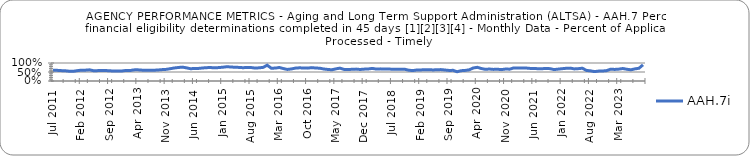
| Category | AAH.7i |
|---|---|
| 2011-07-01 | 0.602 |
| 2011-08-01 | 0.592 |
| 2011-09-01 | 0.577 |
| 2011-10-01 | 0.568 |
| 2011-11-01 | 0.544 |
| 2011-12-01 | 0.539 |
| 2012-01-01 | 0.575 |
| 2012-02-01 | 0.601 |
| 2012-03-01 | 0.601 |
| 2012-04-01 | 0.621 |
| 2012-05-01 | 0.573 |
| 2012-06-01 | 0.576 |
| 2012-07-01 | 0.584 |
| 2012-08-01 | 0.581 |
| 2012-09-01 | 0.569 |
| 2012-10-01 | 0.551 |
| 2012-11-01 | 0.559 |
| 2012-12-01 | 0.556 |
| 2013-01-01 | 0.586 |
| 2013-02-01 | 0.578 |
| 2013-03-01 | 0.618 |
| 2013-04-01 | 0.62 |
| 2013-05-01 | 0.603 |
| 2013-06-01 | 0.593 |
| 2013-07-01 | 0.604 |
| 2013-08-01 | 0.599 |
| 2013-09-01 | 0.613 |
| 2013-10-01 | 0.632 |
| 2013-11-01 | 0.647 |
| 2013-12-01 | 0.684 |
| 2014-01-01 | 0.722 |
| 2014-02-01 | 0.75 |
| 2014-03-01 | 0.771 |
| 2014-04-01 | 0.732 |
| 2014-05-01 | 0.683 |
| 2014-06-01 | 0.692 |
| 2014-07-01 | 0.699 |
| 2014-08-01 | 0.722 |
| 2014-09-01 | 0.742 |
| 2014-10-01 | 0.746 |
| 2014-11-01 | 0.734 |
| 2014-12-01 | 0.745 |
| 2015-01-01 | 0.765 |
| 2015-02-01 | 0.792 |
| 2015-03-01 | 0.78 |
| 2015-04-01 | 0.761 |
| 2015-05-01 | 0.756 |
| 2015-06-01 | 0.739 |
| 2015-07-01 | 0.751 |
| 2015-08-01 | 0.748 |
| 2015-09-01 | 0.718 |
| 2015-10-01 | 0.732 |
| 2015-11-01 | 0.757 |
| 2015-12-01 | 0.878 |
| 2016-01-01 | 0.713 |
| 2016-02-01 | 0.716 |
| 2016-03-01 | 0.751 |
| 2016-04-01 | 0.691 |
| 2016-05-01 | 0.642 |
| 2016-06-01 | 0.671 |
| 2016-07-01 | 0.716 |
| 2016-08-01 | 0.733 |
| 2016-09-01 | 0.723 |
| 2016-10-01 | 0.715 |
| 2016-11-01 | 0.743 |
| 2016-12-01 | 0.722 |
| 2017-01-01 | 0.711 |
| 2017-02-01 | 0.666 |
| 2017-03-01 | 0.642 |
| 2017-04-01 | 0.623 |
| 2017-05-01 | 0.674 |
| 2017-06-01 | 0.714 |
| 2017-07-01 | 0.645 |
| 2017-08-01 | 0.642 |
| 2017-09-01 | 0.648 |
| 2017-10-01 | 0.661 |
| 2017-11-01 | 0.64 |
| 2017-12-01 | 0.659 |
| 2018-01-01 | 0.668 |
| 2018-02-01 | 0.7 |
| 2018-03-01 | 0.661 |
| 2018-04-01 | 0.674 |
| 2018-05-01 | 0.663 |
| 2018-06-01 | 0.671 |
| 2018-07-01 | 0.649 |
| 2018-08-01 | 0.646 |
| 2018-09-01 | 0.647 |
| 2018-10-01 | 0.654 |
| 2018-11-01 | 0.601 |
| 2018-12-01 | 0.577 |
| 2019-01-01 | 0.61 |
| 2019-02-01 | 0.615 |
| 2019-03-01 | 0.625 |
| 2019-04-01 | 0.631 |
| 2019-05-01 | 0.614 |
| 2019-06-01 | 0.624 |
| 2019-07-01 | 0.633 |
| 2019-08-01 | 0.61 |
| 2019-09-01 | 0.587 |
| 2019-10-01 | 0.592 |
| 2019-11-01 | 0.515 |
| 2019-12-01 | 0.574 |
| 2020-01-01 | 0.587 |
| 2020-02-01 | 0.622 |
| 2020-03-01 | 0.724 |
| 2020-04-01 | 0.762 |
| 2020-05-01 | 0.693 |
| 2020-06-01 | 0.649 |
| 2020-07-01 | 0.665 |
| 2020-08-01 | 0.644 |
| 2020-09-01 | 0.653 |
| 2020-10-01 | 0.632 |
| 2020-11-01 | 0.667 |
| 2020-12-01 | 0.657 |
| 2021-01-01 | 0.725 |
| 2021-02-01 | 0.726 |
| 2021-03-01 | 0.716 |
| 2021-04-01 | 0.723 |
| 2021-05-01 | 0.701 |
| 2021-06-01 | 0.699 |
| 2021-07-01 | 0.682 |
| 2021-08-01 | 0.682 |
| 2021-09-01 | 0.698 |
| 2021-10-01 | 0.686 |
| 2021-11-01 | 0.633 |
| 2021-12-01 | 0.66 |
| 2022-01-01 | 0.684 |
| 2022-02-01 | 0.706 |
| 2022-03-01 | 0.715 |
| 2022-04-01 | 0.672 |
| 2022-05-01 | 0.686 |
| 2022-06-01 | 0.711 |
| 2022-07-01 | 0.587 |
| 2022-08-01 | 0.565 |
| 2022-09-01 | 0.522 |
| 2022-10-01 | 0.55 |
| 2022-11-01 | 0.556 |
| 2022-12-01 | 0.576 |
| 2023-01-01 | 0.657 |
| 2023-02-01 | 0.643 |
| 2023-03-01 | 0.659 |
| 2023-04-01 | 0.694 |
| 2023-05-01 | 0.652 |
| 2023-06-01 | 0.622 |
| 2023-07-01 | 0.673 |
| 2023-08-01 | 0.707 |
| 2023-09-01 | 0.9 |